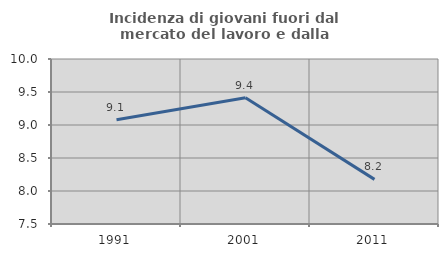
| Category | Incidenza di giovani fuori dal mercato del lavoro e dalla formazione  |
|---|---|
| 1991.0 | 9.079 |
| 2001.0 | 9.412 |
| 2011.0 | 8.176 |